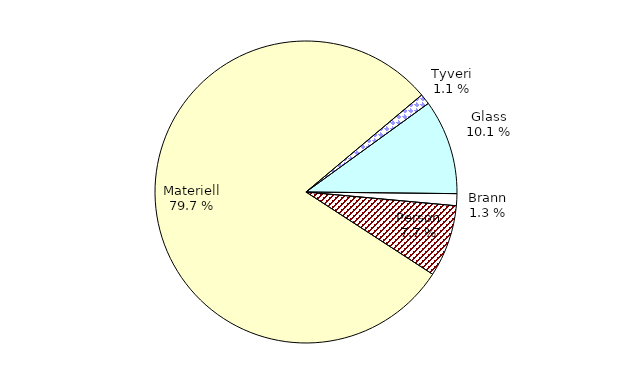
| Category | Series 0 |
|---|---|
| Tyveri | 114.903 |
| Glass | 1026.734 |
| Brann | 129.74 |
| Person | 780.233 |
| Materiell | 8065.512 |